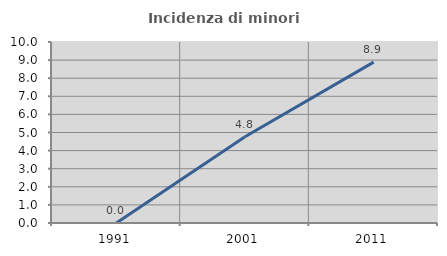
| Category | Incidenza di minori stranieri |
|---|---|
| 1991.0 | 0 |
| 2001.0 | 4.762 |
| 2011.0 | 8.889 |